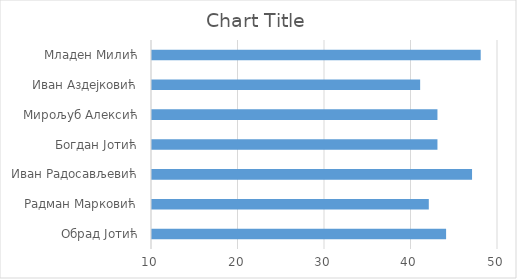
| Category | Series 0 |
|---|---|
| Обрад Јотић | 44 |
| Радман Марковић | 42 |
| Иван Радосављевић | 47 |
| Богдан Јотић | 43 |
| Мирољуб Алексић | 43 |
| Иван Аздејковић | 41 |
| Младен Милић | 48 |